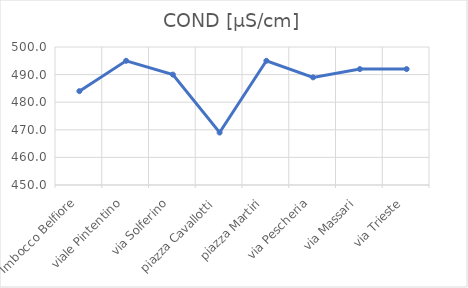
| Category | COND [µS/cm] |
|---|---|
| Imbocco Belfiore | 484 |
| viale Pintentino | 495 |
| via Solferino | 490 |
| piazza Cavallotti | 469 |
| piazza Martiri | 495 |
| via Pescheria | 489 |
| via Massari | 492 |
| via Trieste | 492 |